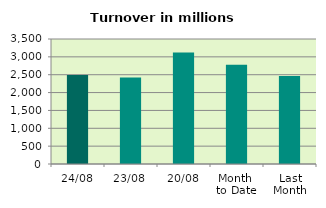
| Category | Series 0 |
|---|---|
| 24/08 | 2492.391 |
| 23/08 | 2425.374 |
| 20/08 | 3123.122 |
| Month 
to Date | 2780.423 |
| Last
Month | 2466.495 |